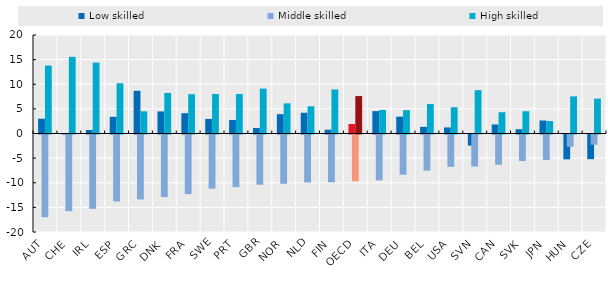
| Category | Low skilled | Middle skilled | High skilled |
|---|---|---|---|
| AUT | 3 | -16.8 | 13.8 |
| CHE | -0.01 | -15.56 | 15.57 |
| IRL | 0.71 | -15.1 | 14.4 |
| ESP | 3.39 | -13.6 | 10.2 |
| GRC | 8.67 | -13.2 | 4.51 |
| DNK | 4.48 | -12.7 | 8.23 |
| FRA | 4.12 | -12.1 | 7.99 |
| SWE | 2.96 | -11 | 8.02 |
| PRT | 2.73 | -10.7 | 8.02 |
| GBR | 1.12 | -10.2 | 9.12 |
| NOR | 3.92 | -10 | 6.12 |
| NLD | 4.21 | -9.74 | 5.53 |
| FIN | 0.77 | -9.71 | 8.94 |
| OECD | 1.93 | -9.52 | 7.6 |
| ITA | 4.55 | -9.33 | 4.78 |
| DEU | 3.42 | -8.16 | 4.74 |
| BEL | 1.35 | -7.33 | 5.98 |
| USA | 1.23 | -6.56 | 5.33 |
| SVN | -2.26 | -6.5 | 8.8 |
| CAN | 1.83 | -6.15 | 4.32 |
| SVK | 0.87 | -5.39 | 4.52 |
| JPN | 2.64 | -5.18 | 2.54 |
| HUN | -5.04 | -2.51 | 7.54 |
| CZE | -5.01 | -2.08 | 7.09 |